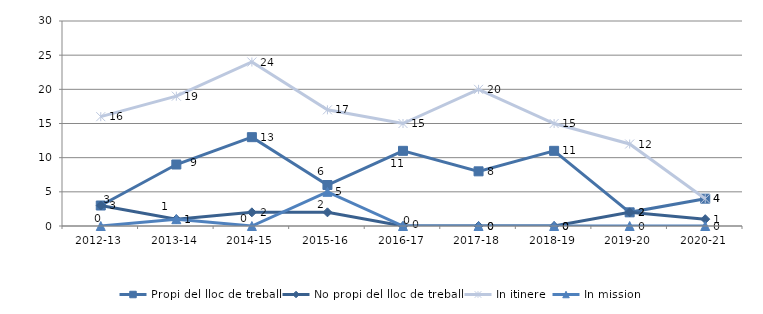
| Category | Propi del lloc de treball | No propi del lloc de treball | In itinere | In mission |
|---|---|---|---|---|
| 2012-13 | 3 | 3 | 16 | 0 |
| 2013-14 | 9 | 1 | 19 | 1 |
| 2014-15 | 13 | 2 | 24 | 0 |
| 2015-16 | 6 | 2 | 17 | 5 |
| 2016-17 | 11 | 0 | 15 | 0 |
| 2017-18 | 8 | 0 | 20 | 0 |
| 2018-19 | 11 | 0 | 15 | 0 |
| 2019-20 | 2 | 2 | 12 | 0 |
| 2020-21 | 4 | 1 | 4 | 0 |